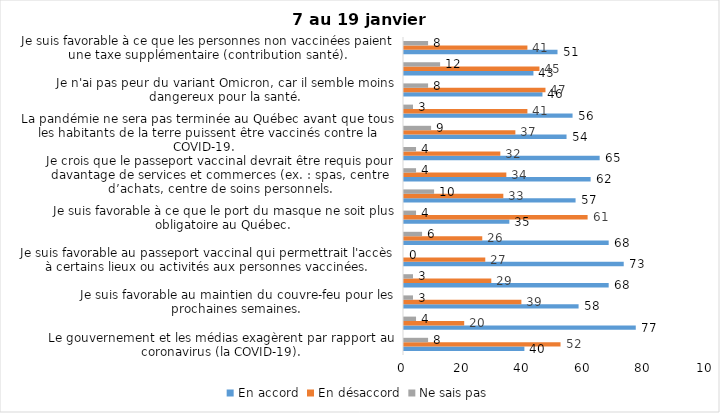
| Category | En accord | En désaccord | Ne sais pas |
|---|---|---|---|
| Le gouvernement et les médias exagèrent par rapport au coronavirus (la COVID-19). | 40 | 52 | 8 |
| J’ai peur que le système de santé soit débordé par les cas de COVID-19. | 77 | 20 | 4 |
| Je suis favorable au maintien du couvre-feu pour les prochaines semaines. | 58 | 39 | 3 |
| Je suis inquiet/inquiète que le nombre de cas augmente en raison des nouveaux variants du virus de la COVID-19. | 68 | 29 | 3 |
| Je suis favorable au passeport vaccinal qui permettrait l'accès à certains lieux ou activités aux personnes vaccinées. | 73 | 27 | 0 |
| Je suis confiant que la vaccination protège efficacement contre les variants de la COVID-19 | 68 | 26 | 6 |
| Je suis favorable à ce que le port du masque ne soit plus obligatoire au Québec. | 35 | 61 | 4 |
| J'ai peur que la reprise des cours en présentiel dans les écoles primaires et secondaires génère une augmentation des cas de COVID-19 | 57 | 33 | 10 |
| Je crois que le passeport vaccinal devrait être requis pour davantage de services et commerces (ex. : spas, centre d’achats, centre de soins personnels. | 62 | 34 | 4 |
| Les personnes non adéquatement vaccinées contre la COVID-19 sont responsables des nouveaux cas et hospitalisations et contribuent à la prolongation de la pandémie au Québec. | 65 | 32 | 4 |
| La pandémie ne sera pas terminée au Québec avant que tous les habitants de la terre puissent être vaccinés contre la COVID-19.   | 54 | 37 | 9 |
| Je suis inconfortable d’être en contact avec une personne non vaccinée contre la COVID-19 | 56 | 41 | 3 |
| Je n'ai pas peur du variant Omicron, car il semble moins dangereux pour la santé. | 46 | 47 | 8 |
| La vaccination obligatoire contre la COVID-19 mettrait fin à la pandémie. | 43 | 45 | 12 |
| Je suis favorable à ce que les personnes non vaccinées paient une taxe supplémentaire (contribution santé). | 51 | 41 | 8 |